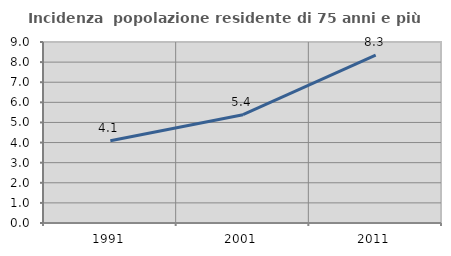
| Category | Incidenza  popolazione residente di 75 anni e più |
|---|---|
| 1991.0 | 4.085 |
| 2001.0 | 5.385 |
| 2011.0 | 8.346 |